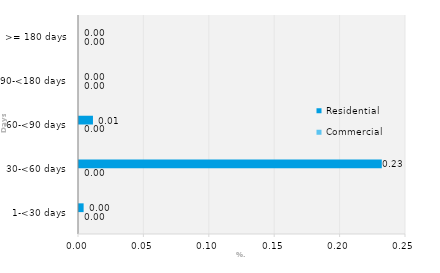
| Category | Commercial | Residential |
|---|---|---|
| 1-<30 days | 0 | 0.004 |
| 30-<60 days | 0 | 0.231 |
| 60-<90 days | 0 | 0.011 |
| 90-<180 days | 0 | 0 |
| >= 180 days | 0 | 0 |